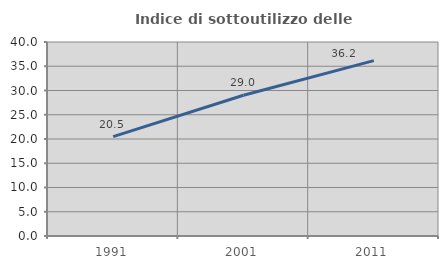
| Category | Indice di sottoutilizzo delle abitazioni  |
|---|---|
| 1991.0 | 20.483 |
| 2001.0 | 29.011 |
| 2011.0 | 36.166 |